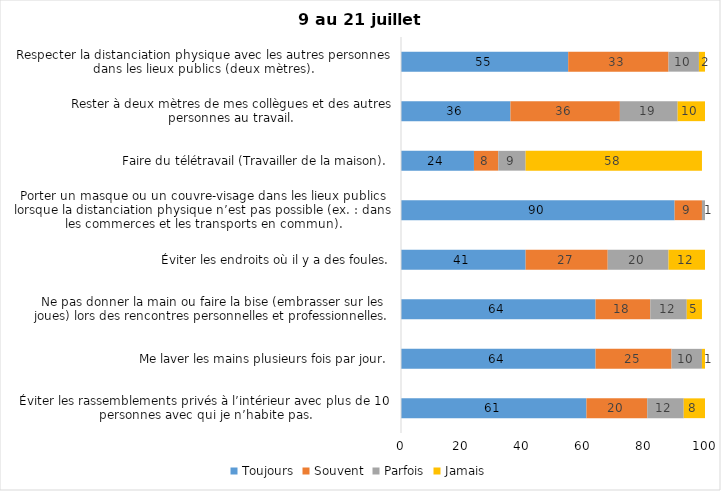
| Category | Toujours | Souvent | Parfois | Jamais |
|---|---|---|---|---|
| Éviter les rassemblements privés à l’intérieur avec plus de 10 personnes avec qui je n’habite pas. | 61 | 20 | 12 | 8 |
| Me laver les mains plusieurs fois par jour. | 64 | 25 | 10 | 1 |
| Ne pas donner la main ou faire la bise (embrasser sur les joues) lors des rencontres personnelles et professionnelles. | 64 | 18 | 12 | 5 |
| Éviter les endroits où il y a des foules. | 41 | 27 | 20 | 12 |
| Porter un masque ou un couvre-visage dans les lieux publics lorsque la distanciation physique n’est pas possible (ex. : dans les commerces et les transports en commun). | 90 | 9 | 1 | 0 |
| Faire du télétravail (Travailler de la maison). | 24 | 8 | 9 | 58 |
| Rester à deux mètres de mes collègues et des autres personnes au travail. | 36 | 36 | 19 | 10 |
| Respecter la distanciation physique avec les autres personnes dans les lieux publics (deux mètres). | 55 | 33 | 10 | 2 |